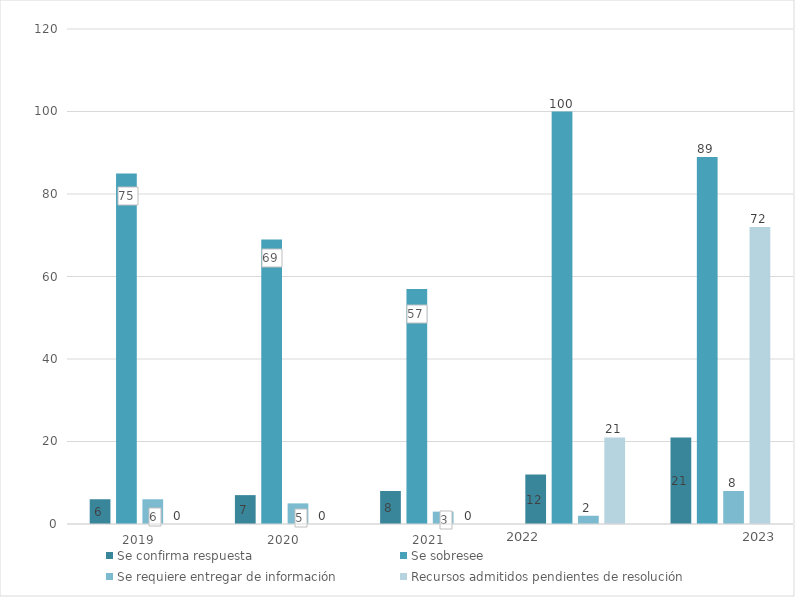
| Category | Se confirma respuesta | Se sobresee  | Se requiere entregar de información  | Recursos admitidos pendientes de resolución |
|---|---|---|---|---|
| 2019.0 | 6 | 85 | 6 | 0 |
| 2020.0 | 7 | 69 | 5 | 0 |
| 2021.0 | 8 | 57 | 3 | 0 |